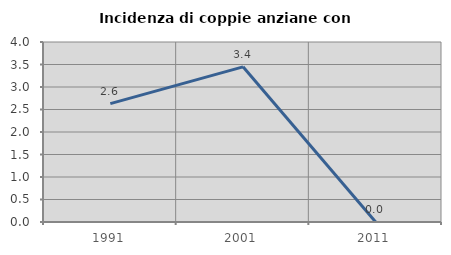
| Category | Incidenza di coppie anziane con figli |
|---|---|
| 1991.0 | 2.632 |
| 2001.0 | 3.448 |
| 2011.0 | 0 |